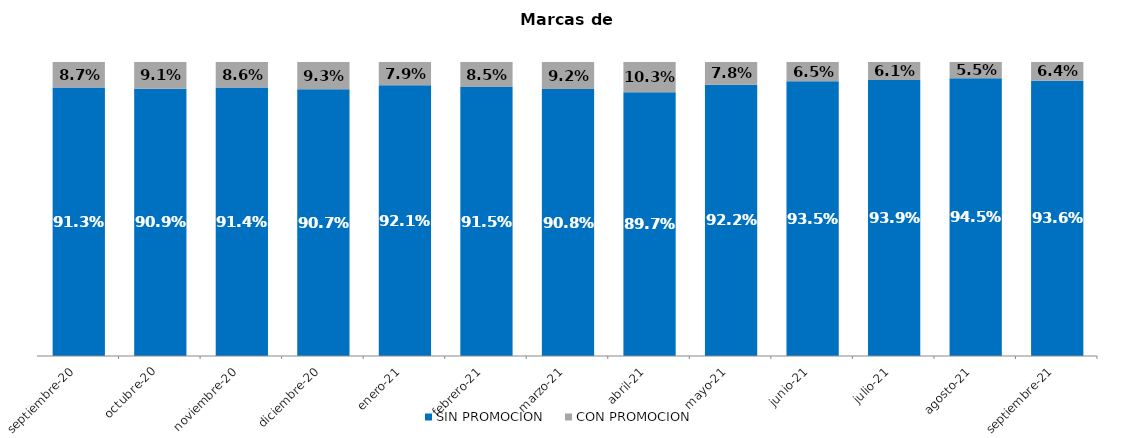
| Category | SIN PROMOCION   | CON PROMOCION   |
|---|---|---|
| 2020-09-01 | 0.913 | 0.087 |
| 2020-10-01 | 0.909 | 0.091 |
| 2020-11-01 | 0.914 | 0.086 |
| 2020-12-01 | 0.907 | 0.093 |
| 2021-01-01 | 0.921 | 0.079 |
| 2021-02-01 | 0.915 | 0.085 |
| 2021-03-01 | 0.908 | 0.092 |
| 2021-04-01 | 0.897 | 0.103 |
| 2021-05-01 | 0.922 | 0.078 |
| 2021-06-01 | 0.935 | 0.065 |
| 2021-07-01 | 0.939 | 0.061 |
| 2021-08-01 | 0.945 | 0.055 |
| 2021-09-01 | 0.936 | 0.064 |